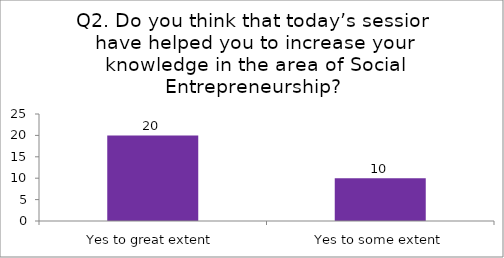
| Category | Q2. Do you think that today’s session have helped you to increase your knowledge in the area of Social Entrepreneurship? |
|---|---|
| Yes to great extent | 20 |
| Yes to some extent | 10 |